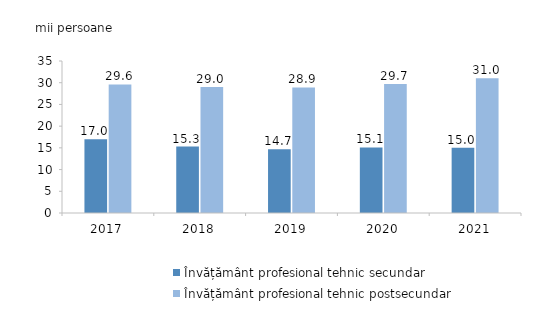
| Category | Învățământ profesional tehnic secundar | Învățământ profesional tehnic postsecundar |
|---|---|---|
| 2017.0 | 17 | 29.6 |
| 2018.0 | 15.3 | 29 |
| 2019.0 | 14.7 | 28.9 |
| 2020.0 | 15.1 | 29.7 |
| 2021.0 | 15 | 31 |